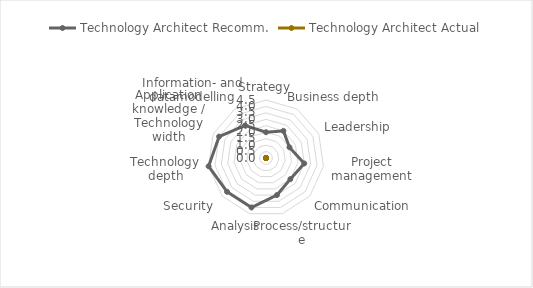
| Category | Technology Architect |
|---|---|
| Strategy |  |
| Business depth |  |
| Leadership |  |
| Project management |  |
| Communication |  |
| Process/structure |  |
| Analysis |  |
| Security |  |
| Technology depth |  |
| Application knowledge / Technology width |  |
| Information- and datamodelling |  |